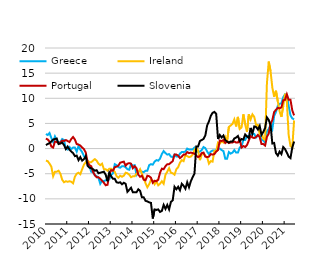
| Category | Greece | Ireland | Portugal | Slovenia |
|---|---|---|---|---|
| 2010-01-31 | 2.9 | -2.4 | 2 | 0.7 |
| 2010-02-28 | 2.7 | -2.5 | 1.8 | 0.9 |
| 2010-03-31 | 3.1 | -3 | 1.4 | 1.1 |
| 2010-04-30 | 2.1 | -3.6 | 0.4 | 1.4 |
| 2010-05-31 | 1.3 | -5.5 | 0.2 | 1.8 |
| 2010-06-30 | 2.4 | -4.6 | 1.4 | 1.9 |
| 2010-07-31 | 1.6 | -4.6 | 1.3 | 2 |
| 2010-08-31 | 1.2 | -4.4 | 1.1 | 0.9 |
| 2010-09-30 | 1.3 | -5 | 1.2 | 1 |
| 2010-10-31 | 1.9 | -6.2 | 1.6 | 1.2 |
| 2010-11-30 | 1.7 | -6.7 | 1.5 | 0.7 |
| 2010-12-31 | 0 | -6.5 | 1.7 | -0.1 |
| 2011-01-31 | -0.2 | -6.6 | 1.5 | 0.4 |
| 2011-02-28 | 0.3 | -6.5 | 1.3 | -0.2 |
| 2011-03-31 | -0.1 | -6.6 | 1.9 | -0.6 |
| 2011-04-30 | 0.2 | -6.9 | 2.3 | -0.9 |
| 2011-05-31 | 0.2 | -5.6 | 1.8 | -1.5 |
| 2011-06-30 | -0.6 | -5 | 0.9 | -1.4 |
| 2011-07-31 | 0.5 | -4.8 | 0.8 | -2.3 |
| 2011-08-31 | -0.2 | -5.1 | 0.6 | -1.7 |
| 2011-09-30 | -0.7 | -4.1 | 0.2 | -2.4 |
| 2011-10-31 | -1.5 | -3.2 | -0.1 | -2.1 |
| 2011-11-30 | -1.8 | -2.7 | -0.8 | -1.5 |
| 2011-12-31 | -2.4 | -2.4 | -2.7 | -3.4 |
| 2012-01-31 | -3.5 | -2.7 | -3.3 | -3.8 |
| 2012-02-29 | -4.6 | -2.7 | -3.5 | -3.9 |
| 2012-03-31 | -4.7 | -2.4 | -4.6 | -4.1 |
| 2012-04-30 | -5.3 | -2.1 | -5.3 | -4.4 |
| 2012-05-31 | -5.5 | -2.4 | -5.7 | -4.3 |
| 2012-06-30 | -5.8 | -3 | -5.7 | -4.9 |
| 2012-07-31 | -7 | -3.3 | -6 | -4.8 |
| 2012-08-31 | -6.4 | -3 | -6.4 | -4.7 |
| 2012-09-30 | -6.5 | -4.1 | -6.8 | -4.6 |
| 2012-10-31 | -6.3 | -4.1 | -7.3 | -5.2 |
| 2012-11-30 | -6.1 | -4.4 | -7.2 | -6.5 |
| 2012-12-31 | -6.1 | -4 | -5.2 | -4.8 |
| 2013-01-31 | -5.3 | -4 | -4.3 | -5.5 |
| 2013-02-28 | -4.9 | -4.3 | -4.4 | -6 |
| 2013-03-31 | -3.1 | -4.6 | -3.7 | -6 |
| 2013-04-30 | -3.3 | -5.5 | -3.6 | -6.7 |
| 2013-05-31 | -3.7 | -5.8 | -3.4 | -6.8 |
| 2013-06-30 | -3.8 | -5.4 | -2.8 | -6.7 |
| 2013-07-31 | -3.5 | -5.6 | -2.7 | -7.1 |
| 2013-08-31 | -3.5 | -5.4 | -2.6 | -6.8 |
| 2013-09-30 | -3.7 | -4.8 | -3.4 | -7 |
| 2013-10-31 | -4.1 | -4.9 | -3 | -8.6 |
| 2013-11-30 | -4.2 | -5.2 | -2.9 | -8.2 |
| 2013-12-31 | -3.1 | -5.7 | -3 | -7.8 |
| 2014-01-31 | -3.4 | -5.5 | -3.9 | -8.7 |
| 2014-02-28 | -3.3 | -5.5 | -3.5 | -8.7 |
| 2014-03-31 | -5.2 | -5 | -3.9 | -8.7 |
| 2014-04-30 | -4.6 | -4.7 | -5.2 | -8.1 |
| 2014-05-31 | -4.5 | -4.1 | -5.6 | -8.4 |
| 2014-06-30 | -4.6 | -5 | -5.4 | -9.7 |
| 2014-07-31 | -4.7 | -5.9 | -6.2 | -9.7 |
| 2014-08-31 | -4.4 | -6.9 | -6.3 | -10.4 |
| 2014-09-30 | -4.4 | -7.7 | -5.4 | -10.5 |
| 2014-10-31 | -3.3 | -7.1 | -5.5 | -10.7 |
| 2014-11-30 | -3.1 | -6.2 | -5.8 | -10.8 |
| 2014-12-31 | -3.2 | -6.4 | -6.8 | -13.9 |
| 2015-01-31 | -2.6 | -7.1 | -6.4 | -12.1 |
| 2015-02-28 | -2.3 | -6.5 | -6.5 | -12.2 |
| 2015-03-31 | -2.4 | -7.3 | -6.2 | -12.1 |
| 2015-04-30 | -2 | -7 | -4.8 | -12.6 |
| 2015-05-31 | -1.1 | -6.5 | -4 | -12.4 |
| 2015-06-30 | -0.5 | -7 | -4.1 | -11.2 |
| 2015-07-31 | -0.9 | -5.2 | -3.5 | -12 |
| 2015-08-31 | -1.2 | -4.6 | -3.1 | -11.2 |
| 2015-09-30 | -1.1 | -3.9 | -3.1 | -12.1 |
| 2015-10-31 | -1.6 | -4.8 | -2.8 | -10.6 |
| 2015-11-30 | -1.7 | -4.9 | -2.5 | -10.3 |
| 2015-12-31 | -1.2 | -5.2 | -1.2 | -7.6 |
| 2016-01-31 | -1.6 | -4.1 | -1.2 | -8.1 |
| 2016-02-29 | -1.6 | -3.7 | -1.4 | -7.6 |
| 2016-03-31 | -1 | -2.8 | -1.9 | -8.3 |
| 2016-04-30 | -0.7 | -2.3 | -1.6 | -7 |
| 2016-05-31 | -0.7 | -2.5 | -1.2 | -7.4 |
| 2016-06-30 | -0.6 | -1.3 | -1.2 | -8 |
| 2016-07-31 | 0 | -1.5 | -0.7 | -6.7 |
| 2016-08-31 | -0.2 | -1.7 | -0.9 | -7.7 |
| 2016-09-30 | -0.2 | -1.6 | -0.8 | -6.5 |
| 2016-10-31 | -0.2 | -1.2 | -0.9 | -5.7 |
| 2016-11-30 | 0.2 | -0.3 | -1 | -5 |
| 2016-12-31 | -0.2 | 0.2 | -1.4 | 0.4 |
| 2017-01-31 | -0.7 | -0.4 | -1.7 | 0.4 |
| 2017-02-28 | -0.6 | -2.3 | -1.5 | 1.5 |
| 2017-03-31 | -0.3 | -1.1 | -0.9 | 1.7 |
| 2017-04-30 | 0.3 | -0.9 | -0.8 | 1.9 |
| 2017-05-31 | 0.1 | -1.5 | -1.6 | 2.6 |
| 2017-06-30 | -0.6 | -1.7 | -1.7 | 4.6 |
| 2017-07-31 | -1.1 | -3 | -1.6 | 5.4 |
| 2017-08-31 | -0.6 | -2.5 | -1.1 | 6.5 |
| 2017-09-30 | -0.4 | -2.6 | -1.2 | 7.1 |
| 2017-10-31 | -0.4 | -0.5 | -1.1 | 7.3 |
| 2017-11-30 | -0.3 | -0.5 | -0.6 | 6.9 |
| 2017-12-31 | 0 | 1.2 | -0.3 | 1.9 |
| 2018-01-31 | 0 | 1 | 1.6 | 2.7 |
| 2018-02-28 | -0.3 | 1.4 | 1.5 | 2.2 |
| 2018-03-31 | -0.5 | 1.2 | 1.7 | 2.6 |
| 2018-04-30 | -2 | 2.3 | 1.1 | 1.7 |
| 2018-05-31 | -2 | 1.4 | 1.4 | 1.4 |
| 2018-06-30 | -0.7 | 4.3 | 1.1 | 1.2 |
| 2018-07-31 | -1 | 4.6 | 1.2 | 1.4 |
| 2018-08-31 | -0.8 | 4.9 | 1.2 | 1.4 |
| 2018-09-30 | -0.3 | 5.8 | 1.4 | 2 |
| 2018-10-31 | -0.8 | 4.4 | 1.2 | 2.2 |
| 2018-11-30 | -0.8 | 6.3 | 1.2 | 2.5 |
| 2018-12-31 | 0.2 | 3.9 | 1.8 | 1.5 |
| 2019-01-31 | 0.5 | 4.2 | 0.2 | 1.9 |
| 2019-02-28 | 1.7 | 6.8 | 0.5 | 1.8 |
| 2019-03-31 | 1.7 | 4.8 | 0.3 | 2.8 |
| 2019-04-30 | 2.5 | 3.3 | 0.7 | 2.4 |
| 2019-05-31 | 2.5 | 6.8 | 1.6 | 2.1 |
| 2019-06-30 | 2.6 | 5.8 | 2.5 | 4.1 |
| 2019-07-31 | 2.9 | 6.8 | 2.2 | 3 |
| 2019-08-31 | 2.9 | 6.3 | 2.1 | 4.4 |
| 2019-09-30 | 2.2 | 4.7 | 2.3 | 4.3 |
| 2019-10-31 | 2.6 | 4.7 | 2.7 | 3.8 |
| 2019-11-30 | 2.6 | 2.9 | 2.3 | 4.5 |
| 2019-12-31 | 1.8 | 3.2 | 0.9 | 2.7 |
| 2020-01-31 | 1.6 | 2 | 0.9 | 3.3 |
| 2020-02-29 | 1.2 | 1.7 | 0.6 | 4.1 |
| 2020-03-31 | 3.4 | 13 | 2.3 | 6.2 |
| 2020-04-30 | 3.9 | 17.3 | 3 | 5.7 |
| 2020-05-31 | 4.7 | 15.4 | 4.9 | 4.7 |
| 2020-06-30 | 3.9 | 12.1 | 5.7 | 1 |
| 2020-07-31 | 6.5 | 10.3 | 7.3 | 1.1 |
| 2020-08-31 | 7.3 | 11.5 | 7.7 | -0.9 |
| 2020-09-30 | 8.5 | 9.4 | 8.1 | -1.4 |
| 2020-10-31 | 8.9 | 7.4 | 8 | -0.6 |
| 2020-11-30 | 9 | 6.3 | 8.2 | -1.1 |
| 2020-12-31 | 10.2 | 8.4 | 9.6 | 0.3 |
| 2021-01-31 | 10.8 | 10.9 | 9.7 | -0.1 |
| 2021-02-28 | 10.7 | 9.3 | 10.8 | -0.8 |
| 2021-03-31 | 8.5 | 2.7 | 9.7 | -1.6 |
| 2021-04-30 | 6.6 | 0.5 | 9.7 | -1.9 |
| 2021-05-31 | 6 | 0.2 | 7.6 | 0.2 |
| 2021-06-30 | 5.8 | 5.6 | 6.6 | 1.4 |